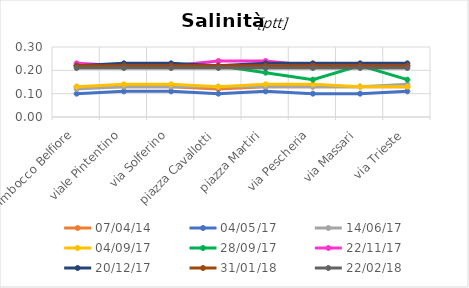
| Category | 07/04/14 | 04/05/17 | 14/06/17 | 04/09/17 | 28/09/17 | 22/11/17 | 20/12/17 | 31/01/18 | 22/02/18 |
|---|---|---|---|---|---|---|---|---|---|
| Imbocco Belfiore | 0.13 | 0.1 | 0.12 | 0.13 | 0.22 | 0.23 | 0.22 | 0.22 | 0.21 |
| viale Pintentino | 0.13 | 0.11 | 0.13 | 0.14 | 0.22 | 0.22 | 0.23 | 0.22 | 0.21 |
| via Solferino | 0.13 | 0.11 | 0.13 | 0.14 | 0.22 | 0.22 | 0.23 | 0.22 | 0.21 |
| piazza Cavallotti | 0.12 | 0.1 | 0.13 | 0.13 | 0.22 | 0.24 | 0.22 | 0.22 | 0.21 |
| piazza Martiri | 0.13 | 0.11 | 0.13 | 0.14 | 0.19 | 0.24 | 0.23 | 0.22 | 0.21 |
| via Pescheria | 0.13 | 0.1 | 0.13 | 0.14 | 0.16 | 0.22 | 0.23 | 0.22 | 0.21 |
| via Massari | 0.13 | 0.1 | 0.13 | 0.13 | 0.22 | 0.22 | 0.23 | 0.22 | 0.21 |
| via Trieste | 0.13 | 0.11 | 0.14 | 0.13 | 0.16 | 0.22 | 0.23 | 0.22 | 0.21 |